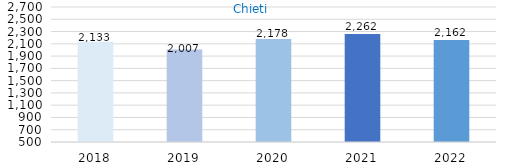
| Category | Series 0 |
|---|---|
| 2018.0 | 2133 |
| 2019.0 | 2007 |
| 2020.0 | 2178 |
| 2021.0 | 2262 |
| 2022.0 | 2162 |